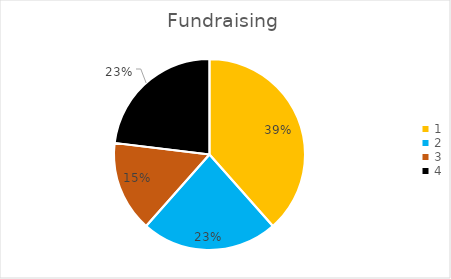
| Category | Series 0 |
|---|---|
| 0 | 0.385 |
| 1 | 0.231 |
| 2 | 0.154 |
| 3 | 0.231 |